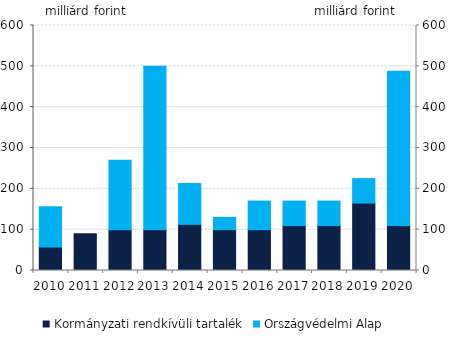
| Category | Kormányzati rendkívüli tartalék | Országvédelmi Alap |
|---|---|---|
| 2010.0 | 57.278 | 98.6 |
| 2011.0 | 90 | 0 |
| 2012.0 | 100 | 170 |
| 2013.0 | 100 | 400 |
| 2014.0 | 113 | 100 |
| 2015.0 | 100 | 30 |
| 2016.0 | 100 | 70 |
| 2017.0 | 110 | 60 |
| 2018.0 | 110 | 60 |
| 2019.0 | 165 | 60 |
| 2020.0 | 110 | 378 |